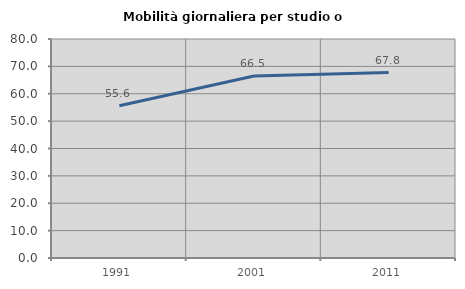
| Category | Mobilità giornaliera per studio o lavoro |
|---|---|
| 1991.0 | 55.645 |
| 2001.0 | 66.488 |
| 2011.0 | 67.754 |